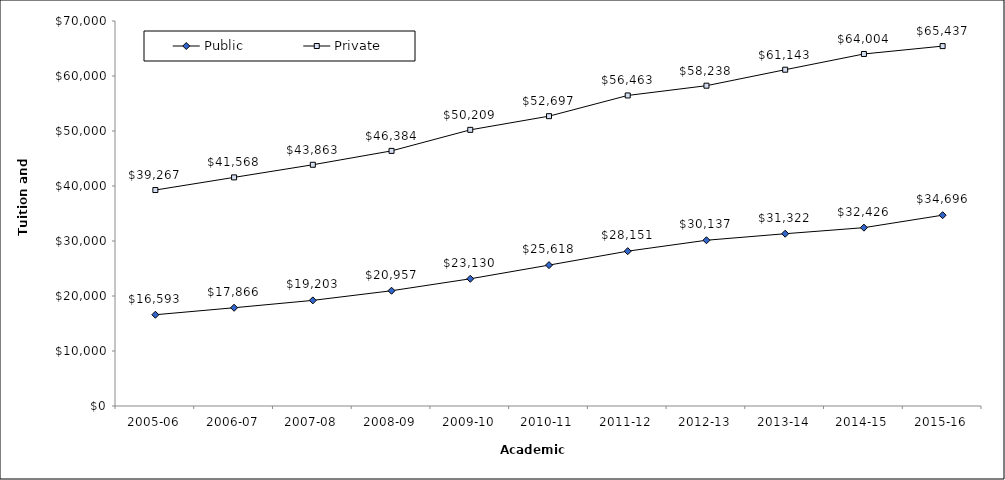
| Category | Public | Private |
|---|---|---|
| 2005-06 | 16593 | 39267 |
| 2006-07 | 17866 | 41568 |
| 2007-08 | 19203 | 43863 |
| 2008-09 | 20957 | 46384 |
| 2009-10 | 23130 | 50209 |
| 2010-11 | 25618 | 52697 |
| 2011-12 | 28151 | 56463 |
| 2012-13 | 30137 | 58238 |
| 2013-14 | 31322 | 61143 |
| 2014-15 | 32426 | 64004 |
| 2015-16 | 34695.56 | 65437.27 |